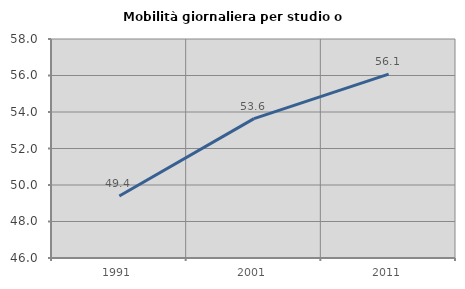
| Category | Mobilità giornaliera per studio o lavoro |
|---|---|
| 1991.0 | 49.395 |
| 2001.0 | 53.639 |
| 2011.0 | 56.077 |